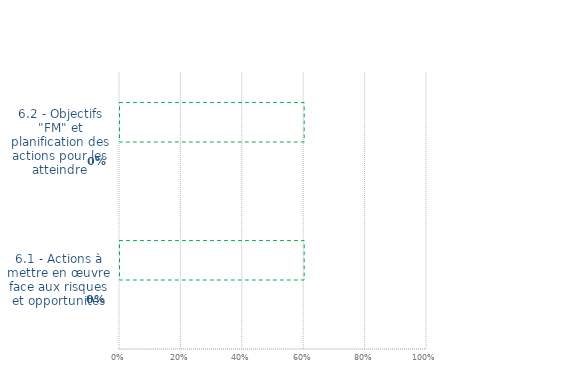
| Category | Art. 6 | limite de CONFORMITÉ |
|---|---|---|
| 6.1 - Actions à mettre en œuvre face aux risques et opportunités | 0 | 0.6 |
| 6.2 - Objectifs "FM" et planification des actions pour les atteindre | 0 | 0.6 |